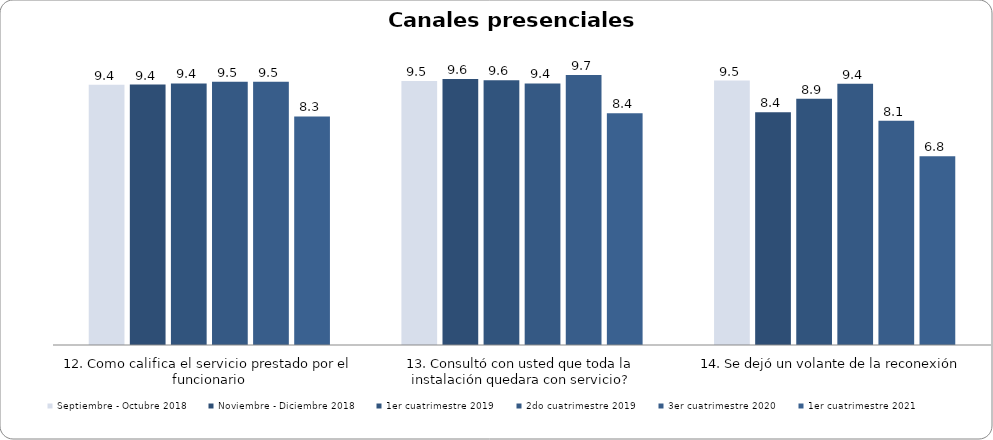
| Category | Septiembre - Octubre 2018 | Noviembre - Diciembre 2018 | 1er cuatrimestre 2019 | 2do cuatrimestre 2019 | 3er cuatrimestre 2020 | 1er cuatrimestre 2021 |
|---|---|---|---|---|---|---|
| 12. Como califica el servicio prestado por el funcionario | 9.395 | 9.4 | 9.444 | 9.5 | 9.5 | 8.252 |
| 13. Consultó con usted que toda la instalación quedara con servicio? | 9.535 | 9.6 | 9.556 | 9.444 | 9.744 | 8.37 |
| 14. Se dejó un volante de la reconexión | 9.545 | 8.4 | 8.889 | 9.429 | 8.095 | 6.813 |